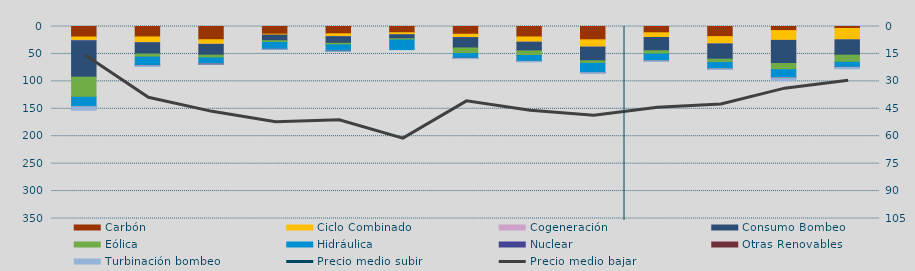
| Category | Carbón | Ciclo Combinado | Cogeneración | Consumo Bombeo | Eólica | Hidráulica | Nuclear | Otras Renovables | Turbinación bombeo |
|---|---|---|---|---|---|---|---|---|---|
| A | 19179.5 | 6106.3 | 488.3 | 66560.4 | 36687.3 | 16841.6 | 0 | 122 | 6609.5 |
| M | 18994.1 | 10277 | 353.4 | 20633.9 | 5611.8 | 15058.8 | 96.2 | 322.7 | 1709.2 |
| J | 24116.3 | 8196.7 | 265.7 | 19665.3 | 5033.9 | 11035.4 | 68.9 | 6.7 | 99.1 |
| J | 14004.7 | 1618.9 | 0 | 10261.3 | 3196.4 | 12305.1 | 26 | 0 | 119 |
| A | 13306.6 | 5191.1 | 57.6 | 12019.4 | 2979.3 | 11389.1 | 0 | 6.3 | 169.4 |
| S | 11365.6 | 3650 | 17 | 7271.8 | 2373.2 | 17475.2 | 0 | 0 | 0 |
| O | 14046.3 | 6143.3 | 63.6 | 18912.3 | 10240.2 | 8461.2 | 80 | 59 | 580.2 |
| N | 19052.6 | 9321.8 | 284.1 | 15774.3 | 8408.4 | 10736.9 | 0 | 4.4 | 901.6 |
| D | 24263.8 | 13149.5 | 124.5 | 24953.2 | 4628 | 16969.4 | 18 | 13.3 | 1598.3 |
| E | 11468 | 8546.1 | 24.8 | 24157.8 | 5990.6 | 12234.2 | 0 | 55 | 1264.7 |
| F | 18455.5 | 13295.6 | 2.4 | 27803.3 | 6004.9 | 11413.9 | 0 | 5.4 | 1349.1 |
| M | 7438 | 17871.7 | 7 | 42074.9 | 11356 | 14642.1 | 0 | 139.1 | 4992 |
| A | 3690.3 | 20633.5 | 19.2 | 27916.2 | 12958.7 | 9108.9 | 0 | 103.2 | 2727.4 |